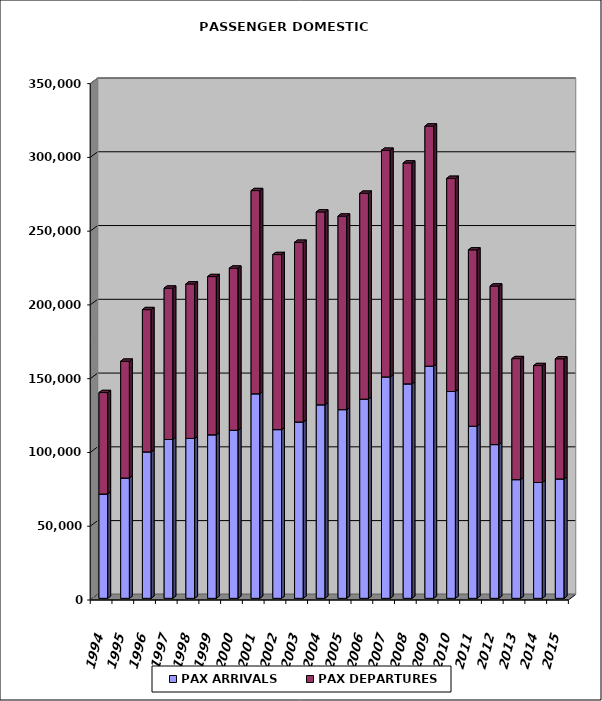
| Category | PAX ARRIVALS | PAX DEPARTURES |
|---|---|---|
| 1994.0 | 70668 | 68798 |
| 1995.0 | 81547 | 79173 |
| 1996.0 | 99252 | 96426 |
| 1997.0 | 107648 | 102615 |
| 1998.0 | 108400 | 104705 |
| 1999.0 | 110840 | 107228 |
| 2000.0 | 113909 | 109900 |
| 2001.0 | 138633 | 137721 |
| 2002.0 | 114356 | 118637 |
| 2003.0 | 119516 | 121807 |
| 2004.0 | 131155 | 130759 |
| 2005.0 | 127902 | 131187 |
| 2006.0 | 135000 | 139571 |
| 2007.0 | 150088 | 153602 |
| 2008.0 | 145352 | 149711 |
| 2009.0 | 157347 | 162756 |
| 2010.0 | 140196 | 144450 |
| 2011.0 | 116642 | 119532 |
| 2012.0 | 104197 | 107479 |
| 2013.0 | 80442 | 82011 |
| 2014.0 | 78506 | 79240 |
| 2015.0 | 80925 | 81410 |